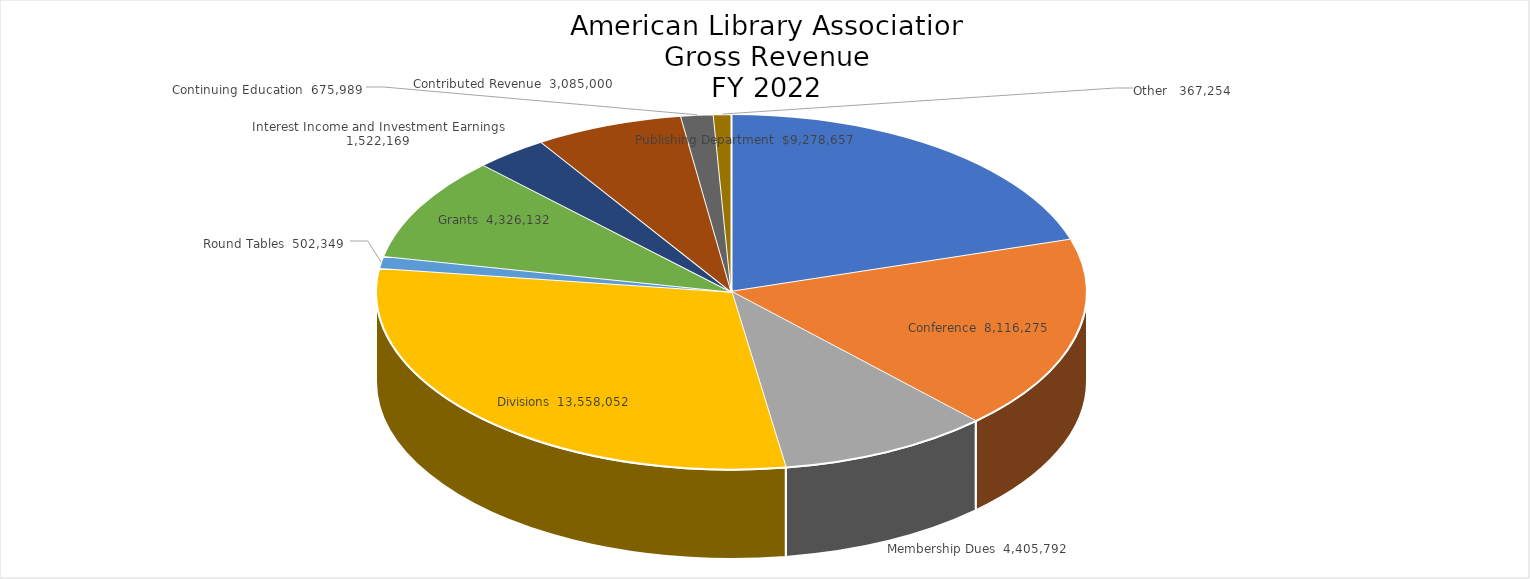
| Category | Series 0 |
|---|---|
| Publishing Department | 9278657 |
| Conference | 8116275 |
| Membership Dues | 4405792 |
| Divisions | 13558051.92 |
| Round Tables | 502349 |
| Grants | 4326132.44 |
| Interest Income and Investment Earnings | 1522169 |
| Contributed Revenue | 3085000 |
| Continuing Education | 675989 |
| Other  | 367253.75 |